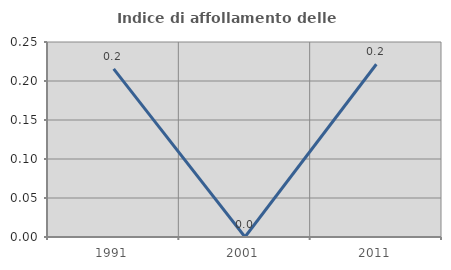
| Category | Indice di affollamento delle abitazioni  |
|---|---|
| 1991.0 | 0.216 |
| 2001.0 | 0 |
| 2011.0 | 0.221 |